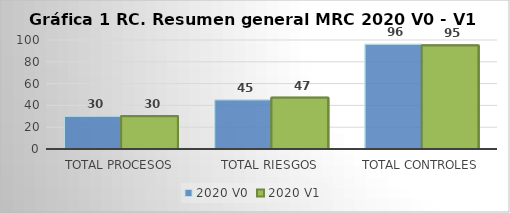
| Category | 2020 V0 | 2020 V1 |
|---|---|---|
| Total procesos | 30 | 30 |
| Total riesgos | 45 | 47 |
| Total controles | 96 | 95 |